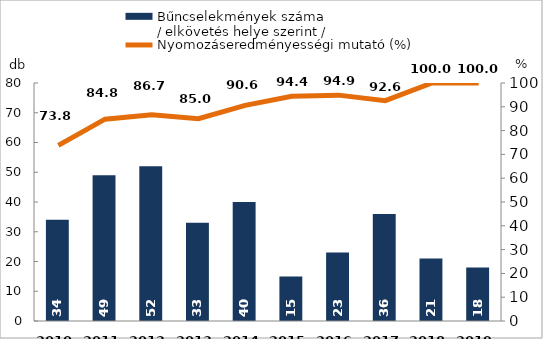
| Category | Bűncselekmények száma
/ elkövetés helye szerint / |
|---|---|
| 2010. év | 34 |
| 2011. év | 49 |
| 2012. év | 52 |
| 2013. év | 33 |
| 2014. év | 40 |
| 2015. év | 15 |
| 2016. év | 23 |
| 2017. év | 36 |
| 2018. év | 21 |
| 2019. év | 18 |